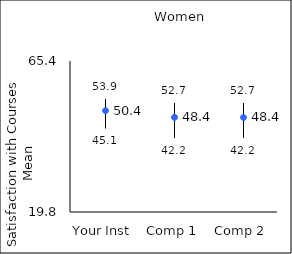
| Category | 25th percentile | 75th percentile | Mean |
|---|---|---|---|
| Your Inst | 45.1 | 53.9 | 50.4 |
| Comp 1 | 42.2 | 52.7 | 48.39 |
| Comp 2 | 42.2 | 52.7 | 48.35 |